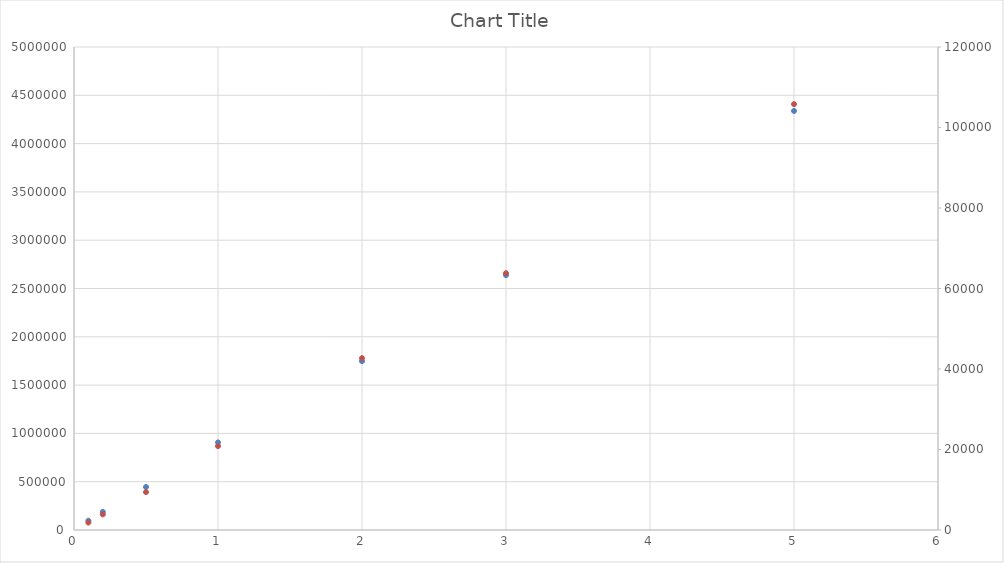
| Category | Series 0 |
|---|---|
| 0.1 | 95962 |
| 0.2 | 188042 |
| 0.5 | 445122 |
| 1.0 | 906342 |
| 2.0 | 1747972 |
| 3.0 | 2638142 |
| 5.0 | 4338142 |